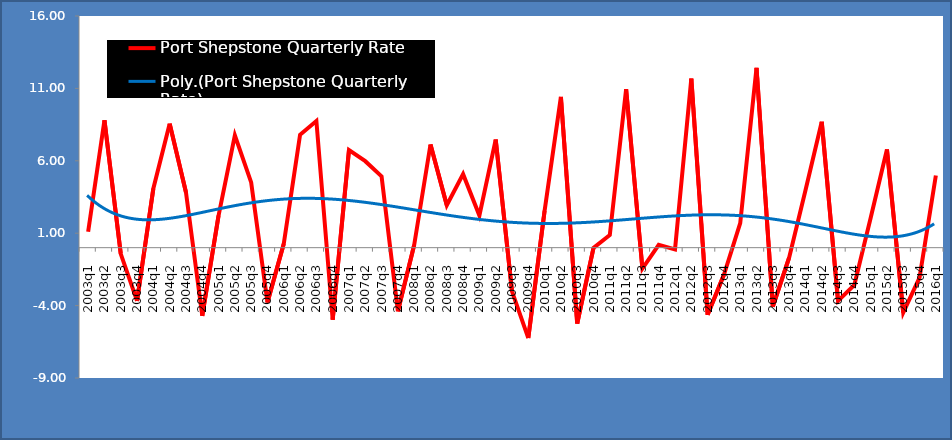
| Category | Port Shepstone Quarterly Rate |
|---|---|
| 2003q1 | 1.098 |
| 2003q2 | 8.804 |
| 2003q3 | -0.426 |
| 2003q4 | -3.68 |
| 2004q1 | 4.091 |
| 2004q2 | 8.565 |
| 2004q3 | 3.826 |
| 2004q4 | -4.708 |
| 2005q1 | 2.222 |
| 2005q2 | 7.753 |
| 2005q3 | 4.504 |
| 2005q4 | -3.79 |
| 2006q1 | 0.268 |
| 2006q2 | 7.797 |
| 2006q3 | 8.753 |
| 2006q4 | -4.973 |
| 2007q1 | 6.736 |
| 2007q2 | 5.975 |
| 2007q3 | 4.922 |
| 2007q4 | -4.398 |
| 2008q1 | 0.188 |
| 2008q2 | 7.129 |
| 2008q3 | 2.928 |
| 2008q4 | 5.077 |
| 2009q1 | 2.22 |
| 2009q2 | 7.466 |
| 2009q3 | -3.011 |
| 2009q4 | -6.242 |
| 2010q1 | 2.555 |
| 2010q2 | 10.415 |
| 2010q3 | -5.238 |
| 2010q4 | -0.017 |
| 2011q1 | 0.875 |
| 2011q2 | 10.946 |
| 2011q3 | -1.444 |
| 2011q4 | 0.191 |
| 2012q1 | -0.118 |
| 2012q2 | 11.681 |
| 2012q3 | -4.635 |
| 2012q4 | -1.875 |
| 2013q1 | 1.69 |
| 2013q2 | 12.424 |
| 2013q3 | -4.063 |
| 2013q4 | -0.691 |
| 2014q1 | 3.954 |
| 2014q2 | 8.695 |
| 2014q3 | -3.67 |
| 2014q4 | -2.581 |
| 2015q1 | 2.048 |
| 2015q2 | 6.786 |
| 2015q3 | -4.475 |
| 2015q4 | -2.069 |
| 2016q1 | 4.985 |